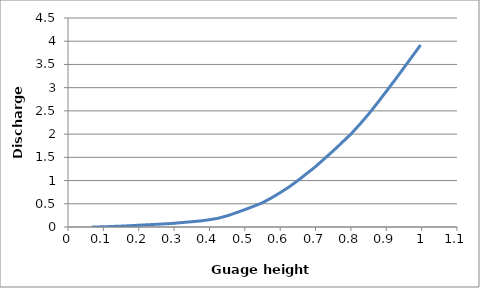
| Category | Series 0 |
|---|---|
| 0.067 | 0 |
| 0.068 | 0 |
| 0.069 | 0 |
| 0.07 | 0 |
| 0.071 | 0 |
| 0.072 | 0 |
| 0.073 | 0 |
| 0.074 | 0 |
| 0.075 | 0 |
| 0.076 | 0.001 |
| 0.077 | 0.001 |
| 0.078 | 0.001 |
| 0.079 | 0.001 |
| 0.08 | 0.001 |
| 0.081 | 0.001 |
| 0.082 | 0.001 |
| 0.083 | 0.001 |
| 0.084 | 0.002 |
| 0.085 | 0.002 |
| 0.086 | 0.002 |
| 0.087 | 0.002 |
| 0.088 | 0.002 |
| 0.089 | 0.002 |
| 0.09 | 0.003 |
| 0.091 | 0.003 |
| 0.092 | 0.003 |
| 0.093 | 0.003 |
| 0.094 | 0.003 |
| 0.095 | 0.004 |
| 0.096 | 0.004 |
| 0.097 | 0.004 |
| 0.098 | 0.004 |
| 0.099 | 0.004 |
| 0.1 | 0.005 |
| 0.101 | 0.005 |
| 0.102 | 0.005 |
| 0.103 | 0.005 |
| 0.104 | 0.005 |
| 0.105 | 0.006 |
| 0.106 | 0.006 |
| 0.107 | 0.006 |
| 0.108 | 0.006 |
| 0.109 | 0.007 |
| 0.11 | 0.007 |
| 0.111 | 0.008 |
| 0.112 | 0.008 |
| 0.113 | 0.008 |
| 0.114 | 0.008 |
| 0.115 | 0.009 |
| 0.116 | 0.009 |
| 0.117 | 0.009 |
| 0.118 | 0.01 |
| 0.119 | 0.01 |
| 0.12 | 0.01 |
| 0.121 | 0.01 |
| 0.122 | 0.011 |
| 0.123 | 0.011 |
| 0.124 | 0.011 |
| 0.125 | 0.012 |
| 0.126 | 0.012 |
| 0.127 | 0.012 |
| 0.128 | 0.013 |
| 0.129 | 0.013 |
| 0.13 | 0.013 |
| 0.131 | 0.014 |
| 0.132 | 0.014 |
| 0.133 | 0.014 |
| 0.134 | 0.014 |
| 0.135 | 0.015 |
| 0.136 | 0.015 |
| 0.137 | 0.015 |
| 0.138 | 0.016 |
| 0.139 | 0.016 |
| 0.14 | 0.016 |
| 0.141 | 0.016 |
| 0.142 | 0.017 |
| 0.143 | 0.017 |
| 0.144 | 0.017 |
| 0.145 | 0.018 |
| 0.146 | 0.018 |
| 0.147 | 0.018 |
| 0.148 | 0.018 |
| 0.149 | 0.019 |
| 0.15 | 0.019 |
| 0.151 | 0.019 |
| 0.152 | 0.02 |
| 0.153 | 0.02 |
| 0.154 | 0.02 |
| 0.155 | 0.02 |
| 0.156 | 0.021 |
| 0.157 | 0.021 |
| 0.158 | 0.021 |
| 0.159 | 0.022 |
| 0.16 | 0.022 |
| 0.161 | 0.022 |
| 0.162 | 0.023 |
| 0.163 | 0.023 |
| 0.164 | 0.024 |
| 0.165 | 0.024 |
| 0.166 | 0.024 |
| 0.167 | 0.025 |
| 0.168 | 0.025 |
| 0.169 | 0.026 |
| 0.17 | 0.026 |
| 0.171 | 0.026 |
| 0.172 | 0.027 |
| 0.173 | 0.027 |
| 0.174 | 0.028 |
| 0.175 | 0.028 |
| 0.176 | 0.028 |
| 0.177 | 0.029 |
| 0.178 | 0.029 |
| 0.179 | 0.03 |
| 0.18 | 0.03 |
| 0.181 | 0.03 |
| 0.182 | 0.031 |
| 0.183 | 0.031 |
| 0.184 | 0.032 |
| 0.185 | 0.032 |
| 0.186 | 0.032 |
| 0.187 | 0.033 |
| 0.188 | 0.033 |
| 0.189 | 0.034 |
| 0.19 | 0.034 |
| 0.191 | 0.034 |
| 0.192 | 0.035 |
| 0.193 | 0.035 |
| 0.194 | 0.036 |
| 0.195 | 0.036 |
| 0.196 | 0.036 |
| 0.197 | 0.037 |
| 0.198 | 0.037 |
| 0.199 | 0.038 |
| 0.2 | 0.038 |
| 0.201 | 0.038 |
| 0.202 | 0.039 |
| 0.203 | 0.039 |
| 0.204 | 0.04 |
| 0.205 | 0.04 |
| 0.206 | 0.04 |
| 0.207 | 0.041 |
| 0.208 | 0.041 |
| 0.209 | 0.042 |
| 0.21 | 0.042 |
| 0.211 | 0.042 |
| 0.212 | 0.043 |
| 0.213 | 0.043 |
| 0.214 | 0.044 |
| 0.215 | 0.044 |
| 0.216 | 0.044 |
| 0.217 | 0.045 |
| 0.218 | 0.045 |
| 0.219 | 0.046 |
| 0.22 | 0.046 |
| 0.221 | 0.046 |
| 0.222 | 0.047 |
| 0.223 | 0.047 |
| 0.224 | 0.048 |
| 0.225 | 0.048 |
| 0.226 | 0.048 |
| 0.227 | 0.049 |
| 0.228 | 0.049 |
| 0.229 | 0.05 |
| 0.23 | 0.05 |
| 0.231 | 0.05 |
| 0.232 | 0.051 |
| 0.233 | 0.051 |
| 0.234 | 0.052 |
| 0.235 | 0.052 |
| 0.236 | 0.052 |
| 0.237 | 0.053 |
| 0.238 | 0.053 |
| 0.239 | 0.054 |
| 0.24 | 0.054 |
| 0.241 | 0.054 |
| 0.242 | 0.055 |
| 0.243 | 0.055 |
| 0.244 | 0.056 |
| 0.245 | 0.056 |
| 0.246 | 0.056 |
| 0.247 | 0.057 |
| 0.248 | 0.057 |
| 0.249 | 0.058 |
| 0.25 | 0.058 |
| 0.251 | 0.058 |
| 0.252 | 0.059 |
| 0.253 | 0.059 |
| 0.254 | 0.06 |
| 0.255 | 0.06 |
| 0.256 | 0.06 |
| 0.257 | 0.061 |
| 0.258 | 0.061 |
| 0.259 | 0.062 |
| 0.26 | 0.062 |
| 0.261 | 0.062 |
| 0.262 | 0.063 |
| 0.263 | 0.063 |
| 0.264 | 0.064 |
| 0.265 | 0.064 |
| 0.266 | 0.064 |
| 0.267 | 0.065 |
| 0.268 | 0.065 |
| 0.269 | 0.066 |
| 0.27 | 0.066 |
| 0.271 | 0.066 |
| 0.272 | 0.067 |
| 0.273 | 0.067 |
| 0.274 | 0.068 |
| 0.275 | 0.068 |
| 0.276 | 0.068 |
| 0.277 | 0.069 |
| 0.278 | 0.069 |
| 0.279 | 0.07 |
| 0.28 | 0.07 |
| 0.281 | 0.07 |
| 0.282 | 0.071 |
| 0.283 | 0.071 |
| 0.284 | 0.072 |
| 0.285 | 0.072 |
| 0.286 | 0.072 |
| 0.287 | 0.073 |
| 0.288 | 0.073 |
| 0.289 | 0.074 |
| 0.29 | 0.074 |
| 0.291 | 0.075 |
| 0.292 | 0.075 |
| 0.293 | 0.076 |
| 0.294 | 0.076 |
| 0.295 | 0.077 |
| 0.296 | 0.078 |
| 0.297 | 0.078 |
| 0.298 | 0.079 |
| 0.299 | 0.079 |
| 0.3 | 0.08 |
| 0.301 | 0.081 |
| 0.302 | 0.081 |
| 0.303 | 0.082 |
| 0.304 | 0.083 |
| 0.305 | 0.083 |
| 0.306 | 0.084 |
| 0.307 | 0.085 |
| 0.308 | 0.085 |
| 0.309 | 0.086 |
| 0.31 | 0.087 |
| 0.311 | 0.088 |
| 0.312 | 0.088 |
| 0.313 | 0.089 |
| 0.314 | 0.09 |
| 0.315 | 0.09 |
| 0.316 | 0.091 |
| 0.317 | 0.092 |
| 0.318 | 0.092 |
| 0.319 | 0.093 |
| 0.32 | 0.094 |
| 0.321 | 0.094 |
| 0.322 | 0.095 |
| 0.323 | 0.096 |
| 0.324 | 0.096 |
| 0.325 | 0.097 |
| 0.326 | 0.098 |
| 0.327 | 0.098 |
| 0.328 | 0.099 |
| 0.329 | 0.1 |
| 0.33 | 0.1 |
| 0.331 | 0.101 |
| 0.332 | 0.102 |
| 0.333 | 0.102 |
| 0.334 | 0.103 |
| 0.335 | 0.104 |
| 0.336 | 0.104 |
| 0.337 | 0.105 |
| 0.338 | 0.106 |
| 0.339 | 0.106 |
| 0.34 | 0.107 |
| 0.341 | 0.108 |
| 0.342 | 0.109 |
| 0.343 | 0.109 |
| 0.344 | 0.11 |
| 0.345 | 0.111 |
| 0.346 | 0.111 |
| 0.347 | 0.112 |
| 0.348 | 0.113 |
| 0.349 | 0.113 |
| 0.35 | 0.114 |
| 0.351 | 0.115 |
| 0.352 | 0.115 |
| 0.353 | 0.116 |
| 0.354 | 0.117 |
| 0.355 | 0.117 |
| 0.356 | 0.118 |
| 0.357 | 0.119 |
| 0.358 | 0.119 |
| 0.359 | 0.12 |
| 0.36 | 0.121 |
| 0.361 | 0.122 |
| 0.362 | 0.122 |
| 0.363 | 0.123 |
| 0.364 | 0.124 |
| 0.365 | 0.124 |
| 0.366 | 0.125 |
| 0.367 | 0.126 |
| 0.368 | 0.126 |
| 0.369 | 0.127 |
| 0.37 | 0.128 |
| 0.371 | 0.128 |
| 0.372 | 0.129 |
| 0.373 | 0.13 |
| 0.374 | 0.13 |
| 0.375 | 0.131 |
| 0.376 | 0.132 |
| 0.377 | 0.133 |
| 0.378 | 0.134 |
| 0.379 | 0.135 |
| 0.38 | 0.136 |
| 0.381 | 0.137 |
| 0.382 | 0.138 |
| 0.383 | 0.139 |
| 0.384 | 0.14 |
| 0.385 | 0.141 |
| 0.386 | 0.142 |
| 0.387 | 0.144 |
| 0.388 | 0.144 |
| 0.389 | 0.146 |
| 0.39 | 0.147 |
| 0.391 | 0.148 |
| 0.392 | 0.149 |
| 0.393 | 0.15 |
| 0.394 | 0.151 |
| 0.395 | 0.152 |
| 0.396 | 0.153 |
| 0.397 | 0.154 |
| 0.398 | 0.155 |
| 0.399 | 0.156 |
| 0.4 | 0.157 |
| 0.401 | 0.158 |
| 0.402 | 0.16 |
| 0.403 | 0.161 |
| 0.404 | 0.162 |
| 0.405 | 0.163 |
| 0.406 | 0.165 |
| 0.407 | 0.166 |
| 0.408 | 0.167 |
| 0.409 | 0.168 |
| 0.41 | 0.17 |
| 0.411 | 0.171 |
| 0.412 | 0.172 |
| 0.413 | 0.174 |
| 0.414 | 0.175 |
| 0.415 | 0.176 |
| 0.416 | 0.178 |
| 0.417 | 0.179 |
| 0.418 | 0.18 |
| 0.419 | 0.181 |
| 0.42 | 0.183 |
| 0.421 | 0.184 |
| 0.422 | 0.185 |
| 0.423 | 0.186 |
| 0.424 | 0.188 |
| 0.425 | 0.189 |
| 0.426 | 0.191 |
| 0.427 | 0.193 |
| 0.428 | 0.195 |
| 0.429 | 0.197 |
| 0.43 | 0.199 |
| 0.431 | 0.202 |
| 0.432 | 0.204 |
| 0.433 | 0.206 |
| 0.434 | 0.208 |
| 0.435 | 0.21 |
| 0.436 | 0.212 |
| 0.437 | 0.214 |
| 0.438 | 0.216 |
| 0.439 | 0.218 |
| 0.44 | 0.22 |
| 0.441 | 0.222 |
| 0.442 | 0.224 |
| 0.443 | 0.226 |
| 0.444 | 0.228 |
| 0.445 | 0.231 |
| 0.446 | 0.233 |
| 0.447 | 0.235 |
| 0.448 | 0.237 |
| 0.449 | 0.239 |
| 0.45 | 0.241 |
| 0.451 | 0.244 |
| 0.452 | 0.246 |
| 0.453 | 0.249 |
| 0.454 | 0.251 |
| 0.455 | 0.254 |
| 0.456 | 0.256 |
| 0.457 | 0.259 |
| 0.458 | 0.262 |
| 0.459 | 0.264 |
| 0.46 | 0.267 |
| 0.461 | 0.269 |
| 0.462 | 0.272 |
| 0.463 | 0.274 |
| 0.464 | 0.277 |
| 0.465 | 0.279 |
| 0.466 | 0.282 |
| 0.467 | 0.284 |
| 0.468 | 0.287 |
| 0.469 | 0.29 |
| 0.47 | 0.292 |
| 0.471 | 0.295 |
| 0.472 | 0.297 |
| 0.473 | 0.3 |
| 0.474 | 0.302 |
| 0.475 | 0.305 |
| 0.476 | 0.308 |
| 0.477 | 0.31 |
| 0.478 | 0.313 |
| 0.479 | 0.316 |
| 0.48 | 0.319 |
| 0.481 | 0.322 |
| 0.482 | 0.324 |
| 0.483 | 0.327 |
| 0.484 | 0.33 |
| 0.485 | 0.333 |
| 0.486 | 0.335 |
| 0.487 | 0.338 |
| 0.488 | 0.341 |
| 0.489 | 0.344 |
| 0.49 | 0.346 |
| 0.491 | 0.349 |
| 0.492 | 0.352 |
| 0.493 | 0.355 |
| 0.494 | 0.357 |
| 0.495 | 0.36 |
| 0.496 | 0.363 |
| 0.497 | 0.366 |
| 0.498 | 0.368 |
| 0.499 | 0.371 |
| 0.5 | 0.374 |
| 0.501 | 0.377 |
| 0.502 | 0.38 |
| 0.503 | 0.383 |
| 0.504 | 0.386 |
| 0.505 | 0.388 |
| 0.506 | 0.391 |
| 0.507 | 0.394 |
| 0.508 | 0.397 |
| 0.509 | 0.4 |
| 0.51 | 0.403 |
| 0.511 | 0.406 |
| 0.512 | 0.409 |
| 0.513 | 0.411 |
| 0.514 | 0.414 |
| 0.515 | 0.417 |
| 0.516 | 0.42 |
| 0.517 | 0.423 |
| 0.518 | 0.426 |
| 0.519 | 0.429 |
| 0.52 | 0.432 |
| 0.521 | 0.434 |
| 0.522 | 0.437 |
| 0.523 | 0.44 |
| 0.524 | 0.443 |
| 0.525 | 0.446 |
| 0.526 | 0.449 |
| 0.527 | 0.452 |
| 0.528 | 0.455 |
| 0.529 | 0.458 |
| 0.53 | 0.461 |
| 0.531 | 0.464 |
| 0.532 | 0.467 |
| 0.533 | 0.47 |
| 0.534 | 0.473 |
| 0.535 | 0.476 |
| 0.536 | 0.479 |
| 0.537 | 0.482 |
| 0.538 | 0.486 |
| 0.539 | 0.489 |
| 0.54 | 0.492 |
| 0.541 | 0.495 |
| 0.542 | 0.498 |
| 0.543 | 0.501 |
| 0.544 | 0.504 |
| 0.545 | 0.507 |
| 0.546 | 0.51 |
| 0.547 | 0.513 |
| 0.548 | 0.516 |
| 0.549 | 0.519 |
| 0.55 | 0.522 |
| 0.551 | 0.526 |
| 0.552 | 0.53 |
| 0.553 | 0.534 |
| 0.554 | 0.538 |
| 0.555 | 0.543 |
| 0.556 | 0.547 |
| 0.557 | 0.551 |
| 0.558 | 0.555 |
| 0.559 | 0.559 |
| 0.56 | 0.563 |
| 0.561 | 0.567 |
| 0.562 | 0.571 |
| 0.563 | 0.576 |
| 0.564 | 0.58 |
| 0.565 | 0.584 |
| 0.566 | 0.588 |
| 0.567 | 0.592 |
| 0.568 | 0.596 |
| 0.569 | 0.6 |
| 0.57 | 0.604 |
| 0.571 | 0.608 |
| 0.572 | 0.613 |
| 0.573 | 0.617 |
| 0.574 | 0.621 |
| 0.575 | 0.625 |
| 0.576 | 0.63 |
| 0.577 | 0.634 |
| 0.578 | 0.639 |
| 0.579 | 0.643 |
| 0.58 | 0.648 |
| 0.581 | 0.652 |
| 0.582 | 0.657 |
| 0.583 | 0.662 |
| 0.584 | 0.666 |
| 0.585 | 0.671 |
| 0.586 | 0.675 |
| 0.587 | 0.68 |
| 0.588 | 0.684 |
| 0.589 | 0.689 |
| 0.59 | 0.693 |
| 0.591 | 0.698 |
| 0.592 | 0.702 |
| 0.593 | 0.707 |
| 0.594 | 0.712 |
| 0.595 | 0.716 |
| 0.596 | 0.721 |
| 0.597 | 0.725 |
| 0.598 | 0.73 |
| 0.599 | 0.734 |
| 0.6 | 0.739 |
| 0.601 | 0.744 |
| 0.602 | 0.749 |
| 0.603 | 0.754 |
| 0.604 | 0.758 |
| 0.605 | 0.763 |
| 0.606 | 0.768 |
| 0.607 | 0.773 |
| 0.608 | 0.778 |
| 0.609 | 0.783 |
| 0.61 | 0.788 |
| 0.611 | 0.793 |
| 0.612 | 0.798 |
| 0.613 | 0.802 |
| 0.614 | 0.807 |
| 0.615 | 0.812 |
| 0.616 | 0.817 |
| 0.617 | 0.822 |
| 0.618 | 0.827 |
| 0.619 | 0.832 |
| 0.62 | 0.837 |
| 0.621 | 0.842 |
| 0.622 | 0.846 |
| 0.623 | 0.851 |
| 0.624 | 0.856 |
| 0.625 | 0.861 |
| 0.626 | 0.867 |
| 0.627 | 0.872 |
| 0.628 | 0.878 |
| 0.629 | 0.883 |
| 0.63 | 0.889 |
| 0.631 | 0.894 |
| 0.632 | 0.9 |
| 0.633 | 0.906 |
| 0.634 | 0.911 |
| 0.635 | 0.917 |
| 0.636 | 0.922 |
| 0.637 | 0.928 |
| 0.638 | 0.933 |
| 0.639 | 0.939 |
| 0.64 | 0.944 |
| 0.641 | 0.95 |
| 0.642 | 0.956 |
| 0.643 | 0.961 |
| 0.644 | 0.967 |
| 0.645 | 0.972 |
| 0.646 | 0.978 |
| 0.647 | 0.983 |
| 0.648 | 0.989 |
| 0.649 | 0.994 |
| 0.65 | 1 |
| 0.651 | 1.006 |
| 0.652 | 1.012 |
| 0.653 | 1.018 |
| 0.654 | 1.024 |
| 0.655 | 1.03 |
| 0.656 | 1.036 |
| 0.657 | 1.042 |
| 0.658 | 1.048 |
| 0.659 | 1.054 |
| 0.66 | 1.06 |
| 0.661 | 1.066 |
| 0.662 | 1.072 |
| 0.663 | 1.078 |
| 0.664 | 1.084 |
| 0.665 | 1.09 |
| 0.666 | 1.096 |
| 0.667 | 1.102 |
| 0.668 | 1.108 |
| 0.669 | 1.114 |
| 0.67 | 1.12 |
| 0.671 | 1.126 |
| 0.672 | 1.132 |
| 0.673 | 1.138 |
| 0.674 | 1.144 |
| 0.675 | 1.15 |
| 0.676 | 1.156 |
| 0.677 | 1.162 |
| 0.678 | 1.168 |
| 0.679 | 1.174 |
| 0.68 | 1.18 |
| 0.681 | 1.186 |
| 0.682 | 1.192 |
| 0.683 | 1.198 |
| 0.684 | 1.204 |
| 0.685 | 1.21 |
| 0.686 | 1.216 |
| 0.687 | 1.222 |
| 0.688 | 1.228 |
| 0.689 | 1.234 |
| 0.69 | 1.24 |
| 0.691 | 1.246 |
| 0.692 | 1.252 |
| 0.693 | 1.258 |
| 0.694 | 1.264 |
| 0.695 | 1.27 |
| 0.696 | 1.276 |
| 0.697 | 1.282 |
| 0.698 | 1.288 |
| 0.699 | 1.294 |
| 0.7 | 1.3 |
| 0.701 | 1.307 |
| 0.702 | 1.314 |
| 0.703 | 1.32 |
| 0.704 | 1.327 |
| 0.705 | 1.334 |
| 0.706 | 1.341 |
| 0.707 | 1.348 |
| 0.708 | 1.354 |
| 0.709 | 1.361 |
| 0.71 | 1.368 |
| 0.711 | 1.375 |
| 0.712 | 1.382 |
| 0.713 | 1.388 |
| 0.714 | 1.395 |
| 0.715 | 1.402 |
| 0.716 | 1.409 |
| 0.717 | 1.416 |
| 0.718 | 1.422 |
| 0.719 | 1.429 |
| 0.72 | 1.436 |
| 0.721 | 1.443 |
| 0.722 | 1.45 |
| 0.723 | 1.456 |
| 0.724 | 1.463 |
| 0.725 | 1.47 |
| 0.726 | 1.477 |
| 0.727 | 1.484 |
| 0.728 | 1.49 |
| 0.729 | 1.497 |
| 0.73 | 1.504 |
| 0.731 | 1.511 |
| 0.732 | 1.518 |
| 0.733 | 1.524 |
| 0.734 | 1.531 |
| 0.735 | 1.538 |
| 0.736 | 1.545 |
| 0.737 | 1.552 |
| 0.738 | 1.558 |
| 0.739 | 1.565 |
| 0.74 | 1.572 |
| 0.741 | 1.579 |
| 0.742 | 1.586 |
| 0.743 | 1.592 |
| 0.744 | 1.599 |
| 0.745 | 1.606 |
| 0.746 | 1.613 |
| 0.747 | 1.62 |
| 0.748 | 1.626 |
| 0.749 | 1.633 |
| 0.75 | 1.64 |
| 0.751 | 1.647 |
| 0.752 | 1.654 |
| 0.753 | 1.662 |
| 0.754 | 1.669 |
| 0.755 | 1.676 |
| 0.756 | 1.683 |
| 0.757 | 1.69 |
| 0.758 | 1.698 |
| 0.759 | 1.705 |
| 0.76 | 1.712 |
| 0.761 | 1.719 |
| 0.762 | 1.726 |
| 0.763 | 1.734 |
| 0.764 | 1.741 |
| 0.765 | 1.748 |
| 0.766 | 1.755 |
| 0.767 | 1.762 |
| 0.768 | 1.77 |
| 0.769 | 1.777 |
| 0.77 | 1.784 |
| 0.771 | 1.791 |
| 0.772 | 1.798 |
| 0.773 | 1.806 |
| 0.774 | 1.813 |
| 0.775 | 1.82 |
| 0.776 | 1.827 |
| 0.777 | 1.834 |
| 0.778 | 1.842 |
| 0.779 | 1.849 |
| 0.78 | 1.856 |
| 0.781 | 1.863 |
| 0.782 | 1.87 |
| 0.783 | 1.878 |
| 0.784 | 1.885 |
| 0.785 | 1.892 |
| 0.786 | 1.899 |
| 0.787 | 1.906 |
| 0.788 | 1.914 |
| 0.789 | 1.921 |
| 0.79 | 1.928 |
| 0.791 | 1.935 |
| 0.792 | 1.942 |
| 0.793 | 1.95 |
| 0.794 | 1.957 |
| 0.795 | 1.964 |
| 0.796 | 1.971 |
| 0.797 | 1.978 |
| 0.798 | 1.986 |
| 0.799 | 1.993 |
| 0.8 | 2 |
| 0.801 | 2.008 |
| 0.802 | 2.017 |
| 0.803 | 2.025 |
| 0.804 | 2.034 |
| 0.805 | 2.042 |
| 0.806 | 2.05 |
| 0.807 | 2.059 |
| 0.808 | 2.067 |
| 0.809 | 2.076 |
| 0.81 | 2.084 |
| 0.811 | 2.092 |
| 0.812 | 2.101 |
| 0.813 | 2.109 |
| 0.814 | 2.118 |
| 0.815 | 2.126 |
| 0.816 | 2.134 |
| 0.817 | 2.143 |
| 0.818 | 2.151 |
| 0.819 | 2.16 |
| 0.82 | 2.168 |
| 0.821 | 2.176 |
| 0.822 | 2.185 |
| 0.823 | 2.193 |
| 0.824 | 2.202 |
| 0.825 | 2.21 |
| 0.826 | 2.219 |
| 0.827 | 2.228 |
| 0.828 | 2.236 |
| 0.829 | 2.245 |
| 0.83 | 2.254 |
| 0.831 | 2.263 |
| 0.832 | 2.272 |
| 0.833 | 2.28 |
| 0.834 | 2.289 |
| 0.835 | 2.298 |
| 0.836 | 2.307 |
| 0.837 | 2.316 |
| 0.838 | 2.324 |
| 0.839 | 2.333 |
| 0.84 | 2.342 |
| 0.841 | 2.351 |
| 0.842 | 2.36 |
| 0.843 | 2.368 |
| 0.844 | 2.377 |
| 0.845 | 2.386 |
| 0.846 | 2.395 |
| 0.847 | 2.404 |
| 0.848 | 2.412 |
| 0.849 | 2.421 |
| 0.85 | 2.43 |
| 0.851 | 2.44 |
| 0.852 | 2.449 |
| 0.853 | 2.459 |
| 0.854 | 2.468 |
| 0.855 | 2.478 |
| 0.856 | 2.488 |
| 0.857 | 2.497 |
| 0.858 | 2.507 |
| 0.859 | 2.516 |
| 0.86 | 2.526 |
| 0.861 | 2.536 |
| 0.862 | 2.545 |
| 0.863 | 2.555 |
| 0.864 | 2.564 |
| 0.865 | 2.574 |
| 0.866 | 2.584 |
| 0.867 | 2.593 |
| 0.868 | 2.603 |
| 0.869 | 2.612 |
| 0.87 | 2.622 |
| 0.871 | 2.632 |
| 0.872 | 2.641 |
| 0.873 | 2.651 |
| 0.874 | 2.66 |
| 0.875 | 2.67 |
| 0.876 | 2.68 |
| 0.877 | 2.69 |
| 0.878 | 2.7 |
| 0.879 | 2.71 |
| 0.88 | 2.72 |
| 0.881 | 2.73 |
| 0.882 | 2.74 |
| 0.883 | 2.75 |
| 0.884 | 2.76 |
| 0.885 | 2.77 |
| 0.886 | 2.78 |
| 0.887 | 2.79 |
| 0.888 | 2.8 |
| 0.889 | 2.81 |
| 0.89 | 2.82 |
| 0.891 | 2.83 |
| 0.892 | 2.84 |
| 0.893 | 2.85 |
| 0.894 | 2.86 |
| 0.895 | 2.87 |
| 0.896 | 2.88 |
| 0.897 | 2.89 |
| 0.898 | 2.9 |
| 0.899 | 2.91 |
| 0.9 | 2.92 |
| 0.901 | 2.93 |
| 0.902 | 2.94 |
| 0.903 | 2.95 |
| 0.904 | 2.96 |
| 0.905 | 2.97 |
| 0.906 | 2.98 |
| 0.907 | 2.99 |
| 0.908 | 3 |
| 0.909 | 3.01 |
| 0.91 | 3.02 |
| 0.911 | 3.03 |
| 0.912 | 3.04 |
| 0.913 | 3.05 |
| 0.914 | 3.06 |
| 0.915 | 3.07 |
| 0.916 | 3.08 |
| 0.917 | 3.09 |
| 0.918 | 3.1 |
| 0.919 | 3.11 |
| 0.92 | 3.12 |
| 0.921 | 3.13 |
| 0.922 | 3.14 |
| 0.923 | 3.15 |
| 0.924 | 3.16 |
| 0.925 | 3.17 |
| 0.926 | 3.18 |
| 0.927 | 3.191 |
| 0.928 | 3.201 |
| 0.929 | 3.212 |
| 0.93 | 3.222 |
| 0.931 | 3.232 |
| 0.932 | 3.243 |
| 0.933 | 3.253 |
| 0.934 | 3.264 |
| 0.935 | 3.274 |
| 0.936 | 3.284 |
| 0.937 | 3.295 |
| 0.938 | 3.305 |
| 0.939 | 3.316 |
| 0.94 | 3.326 |
| 0.941 | 3.336 |
| 0.942 | 3.347 |
| 0.943 | 3.357 |
| 0.944 | 3.368 |
| 0.945 | 3.378 |
| 0.946 | 3.388 |
| 0.947 | 3.399 |
| 0.948 | 3.409 |
| 0.949 | 3.42 |
| 0.95 | 3.43 |
| 0.951 | 3.44 |
| 0.952 | 3.451 |
| 0.953 | 3.461 |
| 0.954 | 3.472 |
| 0.955 | 3.482 |
| 0.956 | 3.492 |
| 0.957 | 3.503 |
| 0.958 | 3.513 |
| 0.959 | 3.524 |
| 0.96 | 3.534 |
| 0.961 | 3.544 |
| 0.962 | 3.555 |
| 0.963 | 3.565 |
| 0.964 | 3.576 |
| 0.965 | 3.586 |
| 0.966 | 3.596 |
| 0.967 | 3.607 |
| 0.968 | 3.617 |
| 0.969 | 3.628 |
| 0.97 | 3.638 |
| 0.971 | 3.648 |
| 0.972 | 3.659 |
| 0.973 | 3.669 |
| 0.974 | 3.68 |
| 0.975 | 3.69 |
| 0.976 | 3.7 |
| 0.977 | 3.711 |
| 0.978 | 3.721 |
| 0.979 | 3.732 |
| 0.98 | 3.742 |
| 0.981 | 3.752 |
| 0.982 | 3.763 |
| 0.983 | 3.773 |
| 0.984 | 3.784 |
| 0.985 | 3.794 |
| 0.986 | 3.804 |
| 0.987 | 3.815 |
| 0.988 | 3.825 |
| 0.989 | 3.836 |
| 0.99 | 3.846 |
| 0.991 | 3.856 |
| 0.992 | 3.867 |
| 0.993 | 3.877 |
| 0.994 | 3.888 |
| 0.995 | 3.898 |
| 0.996 | 3.908 |
| 0.997 | 3.919 |
| 0.998 | 3.929 |
| 0.999 | 3.94 |